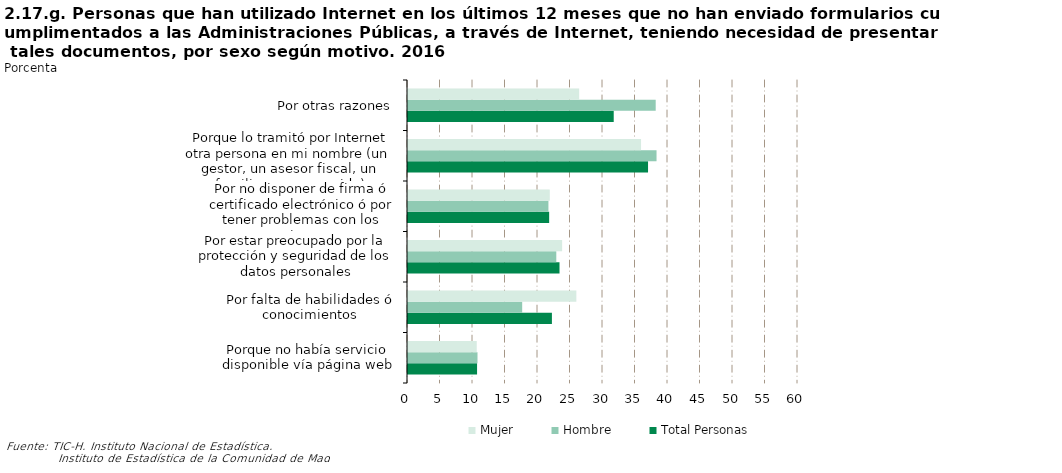
| Category | Total Personas | Hombre | Mujer |
|---|---|---|---|
| Porque no había servicio disponible vía página web | 10.626 | 10.692 | 10.572 |
| Por falta de habilidades ó conocimientos | 22.14 | 17.567 | 25.901 |
| Por estar preocupado por la protección y seguridad de los datos personales | 23.309 | 22.816 | 23.715 |
| Por no disponer de firma ó certificado electrónico ó por tener problemas con los mismos | 21.717 | 21.603 | 21.81 |
| Porque lo tramitó por Internet otra persona en mi nombre (un  gestor, un asesor fiscal, un familiar o un conocido) | 36.93 | 38.236 | 35.857 |
| Por otras razones | 31.649 | 38.107 | 26.337 |